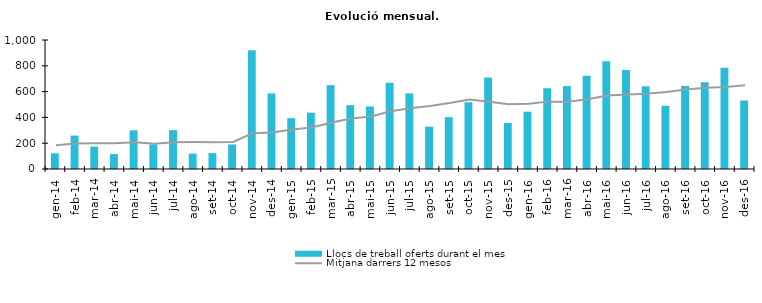
| Category | Llocs de treball oferts durant el mes |
|---|---|
| gen-14 | 122 |
| feb-14 | 259 |
| mar-14 | 174 |
| abr-14 | 116 |
| mai-14 | 300 |
| jun-14 | 191 |
| jul-14 | 301 |
| ago-14 | 119 |
| set-14 | 123 |
| oct-14 | 190 |
| nov-14 | 921 |
| des-14 | 586 |
| gen-15 | 394 |
| feb-15 | 437 |
| mar-15 | 650 |
| abr-15 | 495 |
| mai-15 | 485 |
| jun-15 | 668 |
| jul-15 | 586 |
| ago-15 | 328 |
| set-15 | 402 |
| oct-15 | 517 |
| nov-15 | 709 |
| des-15 | 357 |
| gen-16 | 444 |
| feb-16 | 626 |
| mar-16 | 643 |
| abr-16 | 722 |
| mai-16 | 835 |
| jun-16 | 768 |
| jul-16 | 641 |
| ago-16 | 490 |
| set-16 | 644 |
| oct-16 | 673 |
| nov-16 | 784 |
| des-16 | 531 |